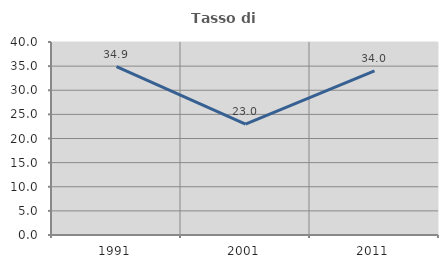
| Category | Tasso di occupazione   |
|---|---|
| 1991.0 | 34.9 |
| 2001.0 | 22.959 |
| 2011.0 | 33.998 |